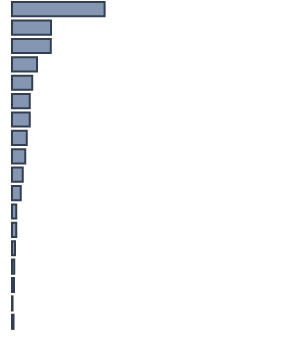
| Category | Series 0 |
|---|---|
| 0 | 33.799 |
| 1 | 14.243 |
| 2 | 14.159 |
| 3 | 9.166 |
| 4 | 7.38 |
| 5 | 6.451 |
| 6 | 6.447 |
| 7 | 5.39 |
| 8 | 4.836 |
| 9 | 3.933 |
| 10 | 3.184 |
| 11 | 1.589 |
| 12 | 1.528 |
| 13 | 1.062 |
| 14 | 0.823 |
| 15 | 0.767 |
| 16 | 0.206 |
| 17 | 0.56 |